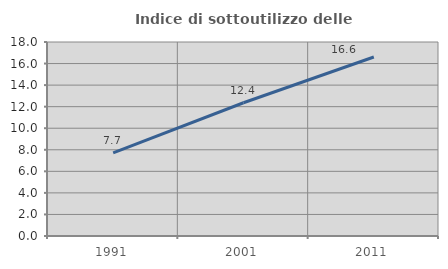
| Category | Indice di sottoutilizzo delle abitazioni  |
|---|---|
| 1991.0 | 7.722 |
| 2001.0 | 12.362 |
| 2011.0 | 16.609 |